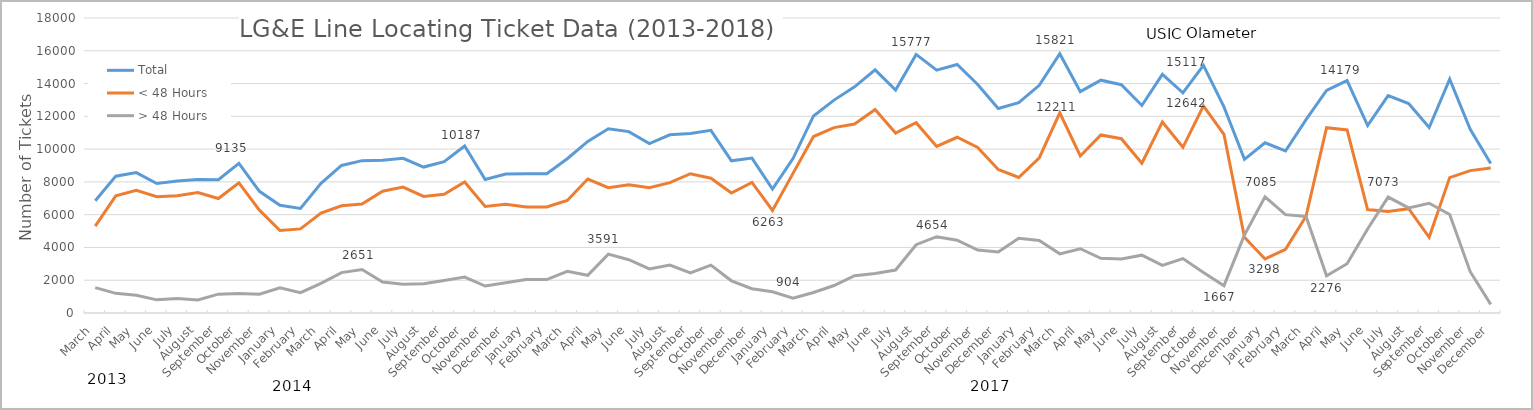
| Category | Total | < 48 Hours | > 48 Hours |
|---|---|---|---|
| March | 6854 | 5306 | 1548 |
| April | 8350 | 7150 | 1200 |
| May | 8568 | 7483 | 1085 |
| June | 7901 | 7099 | 802 |
| July | 8050 | 7159 | 891 |
| August | 8153 | 7355 | 798 |
| September | 8137 | 6988 | 1149 |
| October | 9135 | 7948 | 1187 |
| November | 7422 | 6276 | 1146 |
| January | 6570 | 5037 | 1533 |
| February | 6376 | 5131 | 1245 |
| March | 7911 | 6098 | 1813 |
| April | 9004 | 6539 | 2465 |
| May | 9297 | 6646 | 2651 |
| June | 9326 | 7433 | 1893 |
| July | 9440 | 7687 | 1753 |
| August | 8904 | 7115 | 1789 |
| September | 9231 | 7247 | 1984 |
| October | 10187 | 7992 | 2195 |
| November | 8149 | 6502 | 1647 |
| December | 8480 | 6629 | 1851 |
| January | 8503 | 6465 | 2038 |
| February | 8503 | 6465 | 2038 |
| March | 9414 | 6869 | 2545 |
| April | 10472 | 8174 | 2298 |
| May | 11238 | 7647 | 3591 |
| June | 11069 | 7817 | 3252 |
| July | 10334 | 7641 | 2693 |
| August | 10876 | 7954 | 2922 |
| September | 10948 | 8498 | 2450 |
| October | 11148 | 8224 | 2924 |
| November | 9286 | 7322 | 1964 |
| December | 9451 | 7970 | 1481 |
| January | 7559 | 6263 | 1296 |
| February | 9424 | 8520 | 904 |
| March | 12023 | 10769 | 1254 |
| April | 12990 | 11312 | 1678 |
| May | 13801 | 11527 | 2274 |
| June | 14834 | 12422 | 2412 |
| July | 13602 | 10982 | 2620 |
| August | 15777 | 11610 | 4167 |
| September | 14820 | 10166 | 4654 |
| October | 15163 | 10723 | 4440 |
| November | 13943 | 10104 | 3839 |
| December | 12477 | 8759 | 3718 |
| January | 12833 | 8270 | 4563 |
| February | 13891 | 9468 | 4423 |
| March | 15821 | 12211 | 3610 |
| April | 13505 | 9583 | 3922 |
| May | 14206 | 10865 | 3341 |
| June | 13931 | 10633 | 3298 |
| July | 12663 | 9135 | 3528 |
| August | 14559 | 11657 | 2902 |
| September | 13431 | 10110 | 3321 |
| October | 15117 | 12642 | 2475 |
| November | 12572 | 10905 | 1667 |
| December | 9377 | 4613 | 4764 |
| January | 10383 | 3298 | 7085 |
| February | 9884 | 3882 | 6002 |
| March | 11797 | 5902 | 5895 |
| April | 13581 | 11305 | 2276 |
| May | 14179 | 11170 | 3009 |
| June | 11438 | 6314 | 5124 |
| July | 13266 | 6193 | 7073 |
| August | 12777 | 6367 | 6410 |
| September | 11320 | 4622 | 6698 |
| October | 14270 | 8260 | 6010 |
| November | 11208 | 8687 | 2521 |
| December | 9118 | 8843 | 525 |